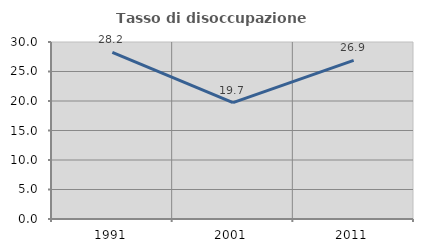
| Category | Tasso di disoccupazione giovanile  |
|---|---|
| 1991.0 | 28.246 |
| 2001.0 | 19.723 |
| 2011.0 | 26.882 |